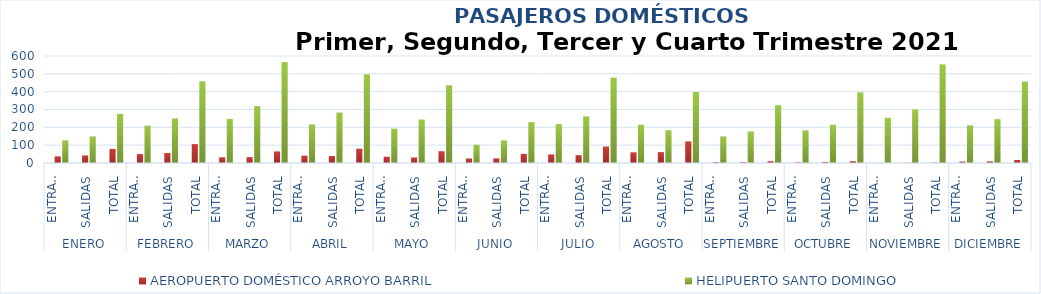
| Category | Series 0 | AEROPUERTO DOMÉSTICO ARROYO BARRIL | HELIPUERTO SANTO DOMINGO |
|---|---|---|---|
| 0 |  | 37 | 127 |
| 1 |  | 42 | 148 |
| 2 |  | 79 | 275 |
| 3 |  | 50 | 209 |
| 4 |  | 56 | 249 |
| 5 |  | 106 | 458 |
| 6 |  | 32 | 247 |
| 7 |  | 33 | 319 |
| 8 |  | 65 | 566 |
| 9 |  | 41 | 215 |
| 10 |  | 39 | 282 |
| 11 |  | 80 | 497 |
| 12 |  | 35 | 192 |
| 13 |  | 31 | 244 |
| 14 |  | 66 | 436 |
| 15 |  | 25 | 102 |
| 16 |  | 26 | 127 |
| 17 |  | 51 | 229 |
| 18 |  | 48 | 218 |
| 19 |  | 44 | 260 |
| 20 |  | 92 | 478 |
| 21 |  | 60 | 214 |
| 22 |  | 61 | 184 |
| 23 |  | 121 | 398 |
| 24 |  | 5 | 148 |
| 25 |  | 5 | 176 |
| 26 |  | 10 | 324 |
| 27 |  | 4 | 182 |
| 28 |  | 6 | 214 |
| 29 |  | 10 | 396 |
| 30 |  | 1 | 253 |
| 31 |  | 1 | 300 |
| 32 |  | 2 | 553 |
| 33 |  | 8 | 210 |
| 34 |  | 9 | 246 |
| 35 |  | 17 | 456 |